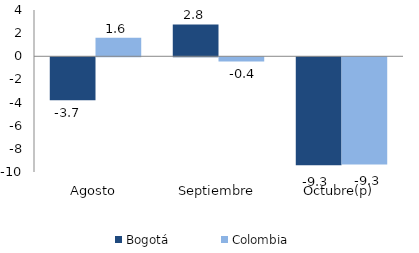
| Category | Bogotá | Colombia |
|---|---|---|
| Agosto | -3.716 | 1.607 |
| Septiembre | 2.754 | -0.355 |
| Octubre(p) | -9.323 | -9.264 |